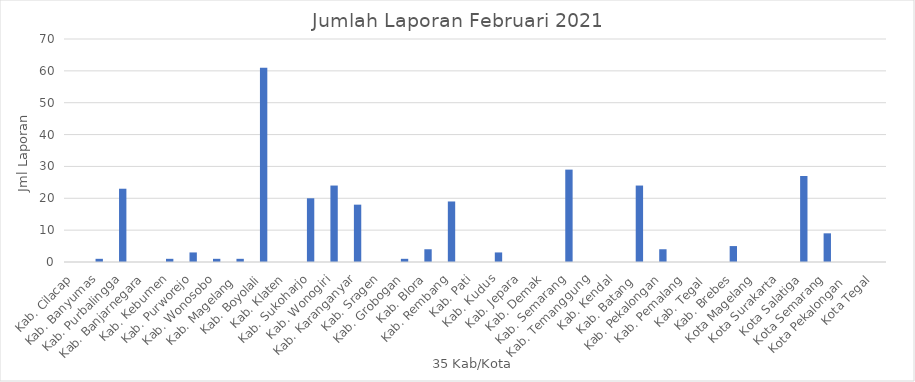
| Category | Series 0 |
|---|---|
| Kab. Cilacap | 0 |
| Kab. Banyumas | 1 |
| Kab. Purbalingga | 23 |
| Kab. Banjarnegara | 0 |
| Kab. Kebumen | 1 |
| Kab. Purworejo | 3 |
| Kab. Wonosobo | 1 |
| Kab. Magelang  | 1 |
| Kab. Boyolali | 61 |
| Kab. Klaten | 0 |
| Kab. Sukoharjo | 20 |
| Kab. Wonogiri | 24 |
| Kab. Karanganyar | 18 |
| Kab. Sragen | 0 |
| Kab. Grobogan | 1 |
| Kab. Blora | 4 |
| Kab. Rembang | 19 |
| Kab. Pati | 0 |
| Kab. Kudus | 3 |
| Kab. Jepara | 0 |
| Kab. Demak | 0 |
| Kab. Semarang | 29 |
| Kab. Temanggung | 0 |
| Kab. Kendal | 0 |
| Kab. Batang  | 24 |
| Kab. Pekalongan | 4 |
| Kab. Pemalang | 0 |
| Kab. Tegal  | 0 |
| Kab. Brebes | 5 |
| Kota Magelang | 0 |
| Kota Surakarta | 0 |
| Kota Salatiga | 27 |
| Kota Semarang | 9 |
| Kota Pekalongan  | 0 |
| Kota Tegal | 0 |